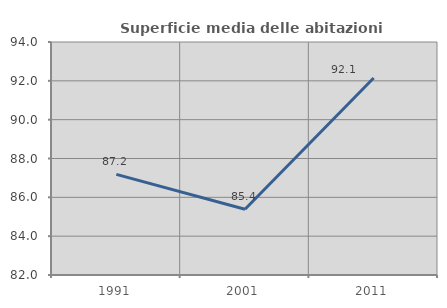
| Category | Superficie media delle abitazioni occupate |
|---|---|
| 1991.0 | 87.18 |
| 2001.0 | 85.383 |
| 2011.0 | 92.148 |